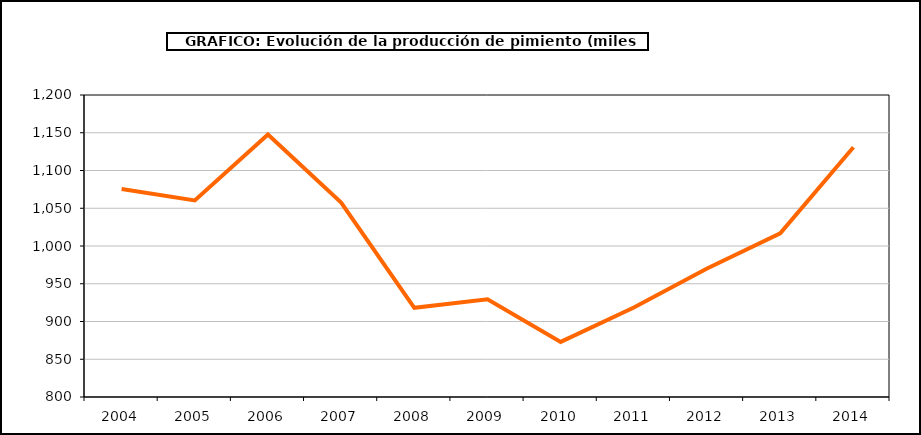
| Category | producción |
|---|---|
| 2004.0 | 1075.509 |
| 2005.0 | 1060.362 |
| 2006.0 | 1147.774 |
| 2007.0 | 1057.533 |
| 2008.0 | 918.14 |
| 2009.0 | 929.317 |
| 2010.0 | 873.011 |
| 2011.0 | 918.549 |
| 2012.0 | 970.296 |
| 2013.0 | 1016.811 |
| 2014.0 | 1130.863 |